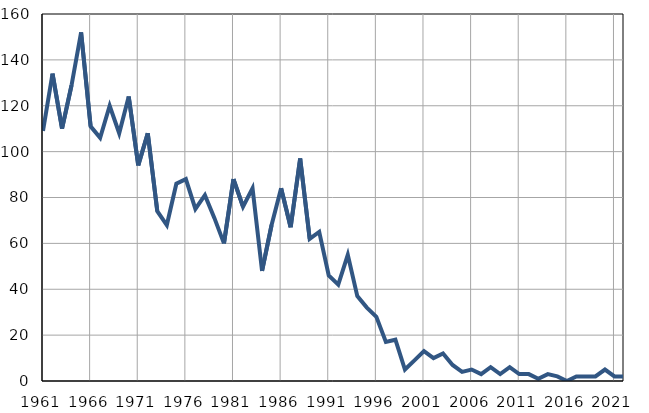
| Category | Infants
deaths |
|---|---|
| 1961.0 | 109 |
| 1962.0 | 134 |
| 1963.0 | 110 |
| 1964.0 | 129 |
| 1965.0 | 152 |
| 1966.0 | 111 |
| 1967.0 | 106 |
| 1968.0 | 120 |
| 1969.0 | 108 |
| 1970.0 | 124 |
| 1971.0 | 94 |
| 1972.0 | 108 |
| 1973.0 | 74 |
| 1974.0 | 68 |
| 1975.0 | 86 |
| 1976.0 | 88 |
| 1977.0 | 75 |
| 1978.0 | 81 |
| 1979.0 | 71 |
| 1980.0 | 60 |
| 1981.0 | 88 |
| 1982.0 | 76 |
| 1983.0 | 84 |
| 1984.0 | 48 |
| 1985.0 | 68 |
| 1986.0 | 84 |
| 1987.0 | 67 |
| 1988.0 | 97 |
| 1989.0 | 62 |
| 1990.0 | 65 |
| 1991.0 | 46 |
| 1992.0 | 42 |
| 1993.0 | 55 |
| 1994.0 | 37 |
| 1995.0 | 32 |
| 1996.0 | 28 |
| 1997.0 | 17 |
| 1998.0 | 18 |
| 1999.0 | 5 |
| 2000.0 | 9 |
| 2001.0 | 13 |
| 2002.0 | 10 |
| 2003.0 | 12 |
| 2004.0 | 7 |
| 2005.0 | 4 |
| 2006.0 | 5 |
| 2007.0 | 3 |
| 2008.0 | 6 |
| 2009.0 | 3 |
| 2010.0 | 6 |
| 2011.0 | 3 |
| 2012.0 | 3 |
| 2013.0 | 1 |
| 2014.0 | 3 |
| 2015.0 | 2 |
| 2016.0 | 0 |
| 2017.0 | 2 |
| 2018.0 | 2 |
| 2019.0 | 2 |
| 2020.0 | 5 |
| 2021.0 | 2 |
| 2022.0 | 2 |